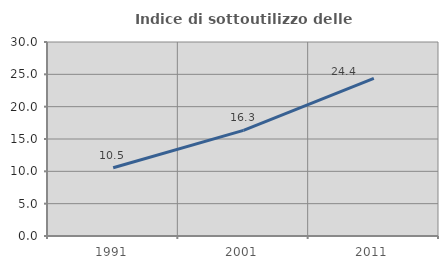
| Category | Indice di sottoutilizzo delle abitazioni  |
|---|---|
| 1991.0 | 10.544 |
| 2001.0 | 16.337 |
| 2011.0 | 24.361 |